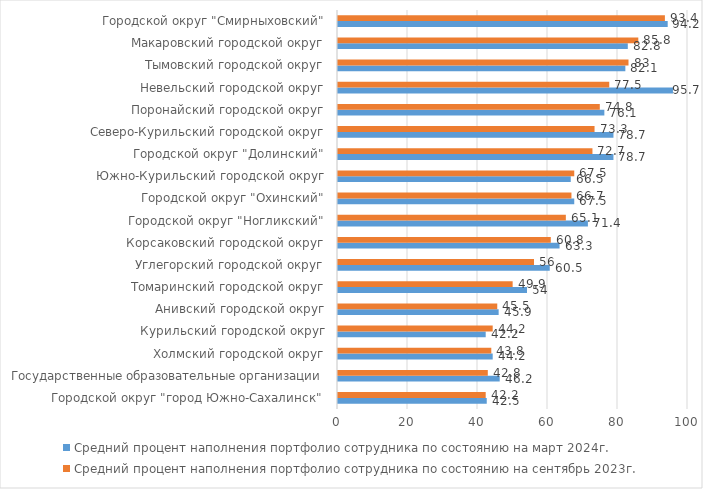
| Category | Средний процент наполнения портфолио сотрудника по состоянию на март 2024г. | Средний процент наполнения портфолио сотрудника по состоянию на сентябрь 2023г. |
|---|---|---|
| Городской округ "город Южно-Сахалинск" | 42.5 | 42.2 |
| Государственные образовательные организации | 46.2 | 42.8 |
| Холмский городской округ | 44.2 | 43.8 |
| Курильский городской округ | 42.2 | 44.2 |
| Анивский городской округ | 45.9 | 45.5 |
| Томаринский городской округ | 54 | 49.9 |
| Углегорский городской округ | 60.5 | 56 |
| Корсаковский городской округ | 63.3 | 60.8 |
| Городской округ "Ногликский" | 71.4 | 65.1 |
| Городской округ "Охинский" | 67.5 | 66.7 |
| Южно-Курильский городской округ | 66.5 | 67.5 |
| Городской округ "Долинский" | 78.7 | 72.7 |
| Северо-Курильский городской округ | 78.7 | 73.3 |
| Поронайский городской округ | 76.1 | 74.8 |
| Невельский городской округ | 95.7 | 77.5 |
| Тымовский городской округ | 82.1 | 83 |
| Макаровский городской округ | 82.8 | 85.8 |
| Городской округ "Смирныховский" | 94.2 | 93.4 |